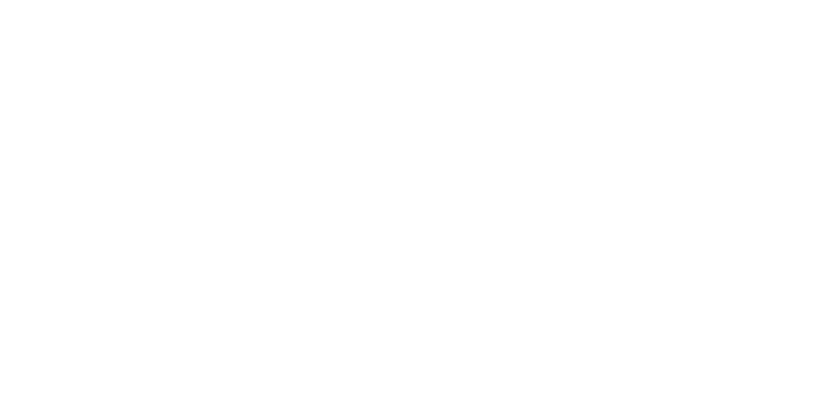
| Category | Total |
|---|---|
| Al Hodeidah | 76264 |
| Hajjah | 59653 |
| Marib | 56508 |
| Taiz | 18226 |
| Al Jawf | 12878 |
| Sadah | 7223 |
| Abyan | 5062 |
| Amran | 4910 |
| Sanaa | 4299 |
| Aden | 3787 |
| Hadramawt | 3250 |
| Ad Dali | 3240 |
| Lahj | 2979 |
| Ibb | 2760 |
| Dhamar | 2173 |
| Al Bayda | 1967 |
| Shabwah | 1249 |
| Al Mahwit | 680 |
| Sanaa City | 553 |
| Al Maharah | 353 |
| Raymah | 197 |
| Socotra | 15 |